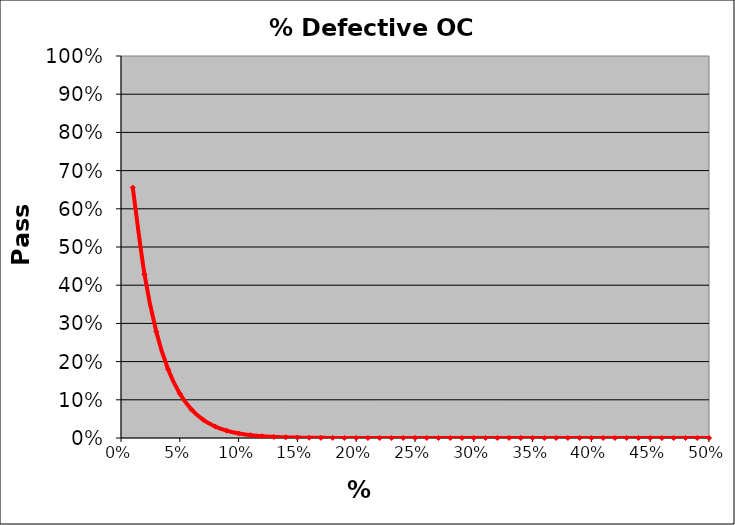
| Category | PASS 
RATE |
|---|---|
| 0.01 | 0.656 |
| 0.02 | 0.428 |
| 0.03 | 0.278 |
| 0.04 | 0.18 |
| 0.05 | 0.116 |
| 0.06 | 0.074 |
| 0.07 | 0.047 |
| 0.08 | 0.03 |
| 0.09 | 0.019 |
| 0.1 | 0.012 |
| 0.11 | 0.007 |
| 0.12 | 0.005 |
| 0.13 | 0.003 |
| 0.14 | 0.002 |
| 0.15 | 0.001 |
| 0.16 | 0.001 |
| 0.17 | 0 |
| 0.18 | 0 |
| 0.19 | 0 |
| 0.2 | 0 |
| 0.21 | 0 |
| 0.22 | 0 |
| 0.23 | 0 |
| 0.24 | 0 |
| 0.25 | 0 |
| 0.26 | 0 |
| 0.27 | 0 |
| 0.28 | 0 |
| 0.29 | 0 |
| 0.3 | 0 |
| 0.31 | 0 |
| 0.32 | 0 |
| 0.33 | 0 |
| 0.34 | 0 |
| 0.35 | 0 |
| 0.36 | 0 |
| 0.37 | 0 |
| 0.38 | 0 |
| 0.39 | 0 |
| 0.4 | 0 |
| 0.41 | 0 |
| 0.42 | 0 |
| 0.43 | 0 |
| 0.44 | 0 |
| 0.45 | 0 |
| 0.46 | 0 |
| 0.47 | 0 |
| 0.48 | 0 |
| 0.49 | 0 |
| 0.499999999999999 | 0 |